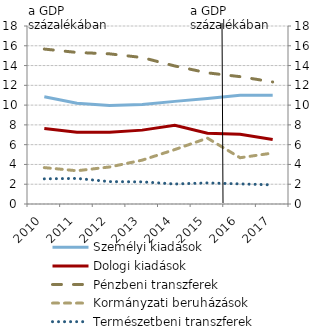
| Category | Személyi kiadások  | Dologi kiadások  | Pénzbeni transzferek | Kormányzati beruházások |
|---|---|---|---|---|
| 2010.0 | 10.853 | 7.625 | 15.667 | 3.681 |
| 2011.0 | 10.189 | 7.266 | 15.324 | 3.362 |
| 2012.0 | 9.954 | 7.266 | 15.184 | 3.743 |
| 2013.0 | 10.072 | 7.471 | 14.812 | 4.433 |
| 2014.0 | 10.378 | 7.967 | 13.957 | 5.505 |
| 2015.0 | 10.664 | 7.148 | 13.264 | 6.66 |
| 2016.0 | 10.992 | 7.049 | 12.878 | 4.678 |
| 2017.0 | 11.007 | 6.531 | 12.342 | 5.153 |